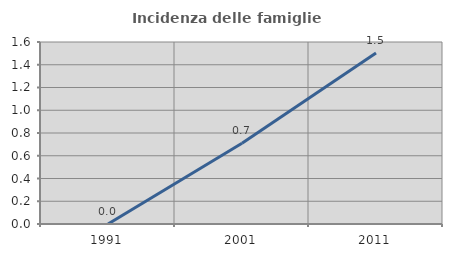
| Category | Incidenza delle famiglie numerose |
|---|---|
| 1991.0 | 0 |
| 2001.0 | 0.709 |
| 2011.0 | 1.504 |